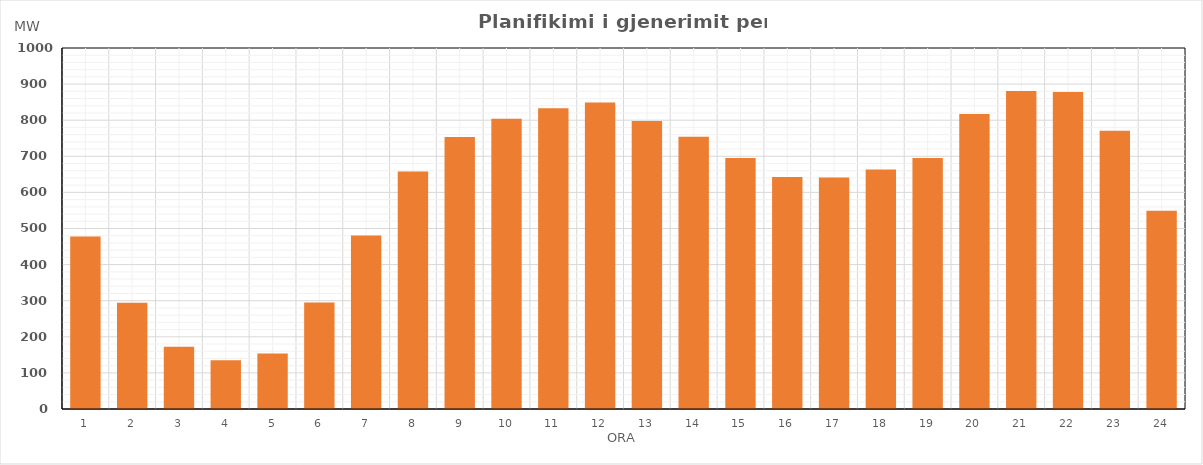
| Category | Max (MW) |
|---|---|
| 0 | 478 |
| 1 | 294.46 |
| 2 | 172.492 |
| 3 | 135.339 |
| 4 | 153.421 |
| 5 | 295.252 |
| 6 | 480.526 |
| 7 | 657.662 |
| 8 | 753.339 |
| 9 | 803.774 |
| 10 | 832.969 |
| 11 | 849.088 |
| 12 | 797.733 |
| 13 | 754.443 |
| 14 | 695 |
| 15 | 642.627 |
| 16 | 641.604 |
| 17 | 663.77 |
| 18 | 695.068 |
| 19 | 817.225 |
| 20 | 880.745 |
| 21 | 877.881 |
| 22 | 771 |
| 23 | 549.26 |